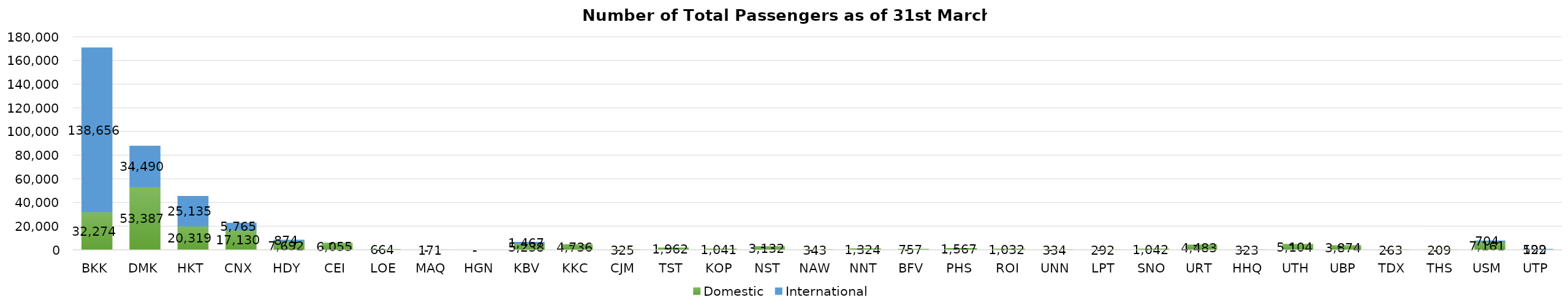
| Category | Domestic | International |
|---|---|---|
| BKK | 32274 | 138656 |
| DMK | 53387 | 34490 |
| HKT | 20319 | 25135 |
| CNX | 17130 | 5765 |
| HDY | 7692 | 874 |
| CEI | 6055 | 0 |
| LOE | 664 | 0 |
| MAQ | 171 | 0 |
| HGN | 0 | 0 |
| KBV | 5238 | 1467 |
| KKC | 4736 | 0 |
| CJM | 325 | 0 |
| TST | 1962 | 0 |
| KOP | 1041 | 0 |
| NST | 3132 | 0 |
| NAW | 343 | 0 |
| NNT | 1324 | 0 |
| BFV | 757 | 0 |
| PHS | 1567 | 0 |
| ROI | 1032 | 0 |
| UNN | 334 | 0 |
| LPT | 292 | 0 |
| SNO | 1042 | 0 |
| URT | 4483 | 0 |
| HHQ | 323 | 0 |
| UTH | 5104 | 0 |
| UBP | 3874 | 0 |
| TDX | 263 | 0 |
| THS | 209 | 0 |
| USM | 7161 | 704 |
| UTP | 529 | 192 |